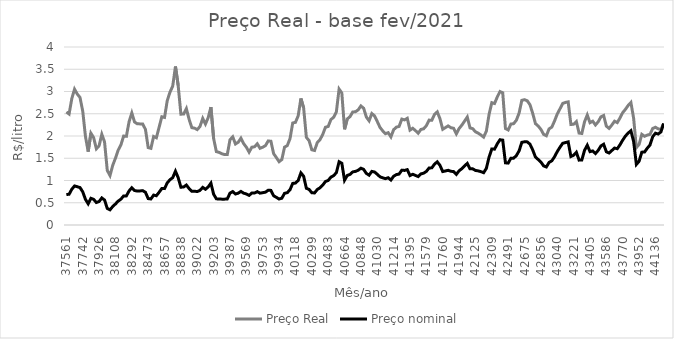
| Category | Preço Real | Preço nominal |
|---|---|---|
| 37561.0 | 2.539 | 0.685 |
| 37591.0 | 2.494 | 0.691 |
| 37622.0 | 2.842 | 0.804 |
| 37653.0 | 3.052 | 0.878 |
| 37681.0 | 2.943 | 0.86 |
| 37712.0 | 2.865 | 0.841 |
| 37742.0 | 2.56 | 0.746 |
| 37773.0 | 1.99 | 0.576 |
| 37803.0 | 1.649 | 0.476 |
| 37834.0 | 2.062 | 0.6 |
| 37865.0 | 1.963 | 0.577 |
| 37895.0 | 1.712 | 0.505 |
| 37926.0 | 1.78 | 0.528 |
| 37956.0 | 2.039 | 0.608 |
| 37987.0 | 1.866 | 0.561 |
| 38018.0 | 1.226 | 0.373 |
| 38047.0 | 1.112 | 0.341 |
| 38078.0 | 1.34 | 0.416 |
| 38108.0 | 1.502 | 0.473 |
| 38139.0 | 1.683 | 0.536 |
| 38169.0 | 1.8 | 0.581 |
| 38200.0 | 1.999 | 0.653 |
| 38231.0 | 1.993 | 0.654 |
| 38261.0 | 2.323 | 0.767 |
| 38292.0 | 2.517 | 0.838 |
| 38322.0 | 2.315 | 0.774 |
| 38353.0 | 2.275 | 0.763 |
| 38384.0 | 2.272 | 0.766 |
| 38412.0 | 2.269 | 0.772 |
| 38443.0 | 2.149 | 0.735 |
| 38473.0 | 1.739 | 0.593 |
| 38504.0 | 1.723 | 0.585 |
| 38534.0 | 1.989 | 0.673 |
| 38565.0 | 1.96 | 0.658 |
| 38596.0 | 2.195 | 0.736 |
| 38626.0 | 2.432 | 0.82 |
| 38657.0 | 2.417 | 0.818 |
| 38687.0 | 2.798 | 0.947 |
| 38718.0 | 2.986 | 1.018 |
| 38749.0 | 3.122 | 1.064 |
| 38777.0 | 3.562 | 1.208 |
| 38808.0 | 3.134 | 1.064 |
| 38838.0 | 2.491 | 0.849 |
| 38869.0 | 2.492 | 0.855 |
| 38899.0 | 2.615 | 0.898 |
| 38930.0 | 2.376 | 0.82 |
| 38961.0 | 2.187 | 0.756 |
| 38991.0 | 2.177 | 0.759 |
| 39022.0 | 2.144 | 0.752 |
| 39052.0 | 2.214 | 0.778 |
| 39083.0 | 2.395 | 0.845 |
| 39114.0 | 2.27 | 0.803 |
| 39142.0 | 2.412 | 0.855 |
| 39173.0 | 2.649 | 0.94 |
| 39203.0 | 1.943 | 0.691 |
| 39234.0 | 1.649 | 0.588 |
| 39264.0 | 1.632 | 0.584 |
| 39295.0 | 1.601 | 0.581 |
| 39326.0 | 1.583 | 0.581 |
| 39356.0 | 1.583 | 0.586 |
| 39387.0 | 1.917 | 0.716 |
| 39417.0 | 1.982 | 0.751 |
| 39448.0 | 1.821 | 0.697 |
| 39479.0 | 1.86 | 0.715 |
| 39508.0 | 1.95 | 0.755 |
| 39539.0 | 1.828 | 0.716 |
| 39569.0 | 1.748 | 0.697 |
| 39600.0 | 1.638 | 0.665 |
| 39630.0 | 1.748 | 0.718 |
| 39661.0 | 1.758 | 0.719 |
| 39692.0 | 1.825 | 0.75 |
| 39722.0 | 1.724 | 0.716 |
| 39753.0 | 1.748 | 0.726 |
| 39783.0 | 1.783 | 0.738 |
| 39814.0 | 1.889 | 0.781 |
| 39845.0 | 1.882 | 0.778 |
| 39873.0 | 1.603 | 0.657 |
| 39904.0 | 1.515 | 0.621 |
| 39934.0 | 1.422 | 0.584 |
| 39965.0 | 1.471 | 0.602 |
| 39995.0 | 1.75 | 0.712 |
| 40026.0 | 1.785 | 0.726 |
| 40057.0 | 1.939 | 0.791 |
| 40087.0 | 2.292 | 0.935 |
| 40118.0 | 2.307 | 0.942 |
| 40148.0 | 2.454 | 1 |
| 40179.0 | 2.844 | 1.171 |
| 40210.0 | 2.632 | 1.096 |
| 40238.0 | 1.97 | 0.825 |
| 40269.0 | 1.895 | 0.8 |
| 40299.0 | 1.69 | 0.724 |
| 40330.0 | 1.675 | 0.72 |
| 40360.0 | 1.851 | 0.798 |
| 40391.0 | 1.918 | 0.836 |
| 40422.0 | 2.034 | 0.896 |
| 40452.0 | 2.197 | 0.978 |
| 40483.0 | 2.214 | 1.001 |
| 40513.0 | 2.369 | 1.075 |
| 40544.0 | 2.421 | 1.109 |
| 40575.0 | 2.542 | 1.176 |
| 40603.0 | 3.055 | 1.422 |
| 40634.0 | 2.966 | 1.388 |
| 40664.0 | 2.15 | 1.006 |
| 40695.0 | 2.384 | 1.114 |
| 40725.0 | 2.435 | 1.137 |
| 40756.0 | 2.539 | 1.193 |
| 40787.0 | 2.545 | 1.205 |
| 40817.0 | 2.588 | 1.23 |
| 40848.0 | 2.676 | 1.277 |
| 40878.0 | 2.624 | 1.25 |
| 40909.0 | 2.425 | 1.159 |
| 40940.0 | 2.341 | 1.12 |
| 40969.0 | 2.504 | 1.204 |
| 41000.0 | 2.452 | 1.191 |
| 41030.0 | 2.326 | 1.14 |
| 41061.0 | 2.194 | 1.083 |
| 41091.0 | 2.115 | 1.06 |
| 41122.0 | 2.052 | 1.042 |
| 41153.0 | 2.075 | 1.062 |
| 41183.0 | 1.98 | 1.011 |
| 41214.0 | 2.142 | 1.096 |
| 41244.0 | 2.199 | 1.132 |
| 41275.0 | 2.215 | 1.145 |
| 41306.0 | 2.38 | 1.232 |
| 41334.0 | 2.362 | 1.226 |
| 41365.0 | 2.398 | 1.244 |
| 41395.0 | 2.132 | 1.11 |
| 41426.0 | 2.173 | 1.14 |
| 41456.0 | 2.122 | 1.114 |
| 41487.0 | 2.063 | 1.089 |
| 41518.0 | 2.147 | 1.148 |
| 41548.0 | 2.162 | 1.164 |
| 41579.0 | 2.232 | 1.205 |
| 41609.0 | 2.357 | 1.281 |
| 41640.0 | 2.355 | 1.285 |
| 41671.0 | 2.487 | 1.369 |
| 41699.0 | 2.542 | 1.42 |
| 41730.0 | 2.386 | 1.338 |
| 41760.0 | 2.151 | 1.201 |
| 41791.0 | 2.189 | 1.215 |
| 41821.0 | 2.227 | 1.229 |
| 41852.0 | 2.186 | 1.207 |
| 41883.0 | 2.174 | 1.201 |
| 41913.0 | 2.049 | 1.138 |
| 41944.0 | 2.168 | 1.218 |
| 41974.0 | 2.244 | 1.266 |
| 42005.0 | 2.335 | 1.326 |
| 42036.0 | 2.426 | 1.385 |
| 42064.0 | 2.183 | 1.261 |
| 42095.0 | 2.164 | 1.262 |
| 42125.0 | 2.095 | 1.226 |
| 42156.0 | 2.063 | 1.216 |
| 42186.0 | 2.022 | 1.199 |
| 42217.0 | 1.975 | 1.176 |
| 42248.0 | 2.109 | 1.273 |
| 42278.0 | 2.489 | 1.529 |
| 42309.0 | 2.749 | 1.709 |
| 42339.0 | 2.73 | 1.705 |
| 42370.0 | 2.878 | 1.824 |
| 42401.0 | 2.999 | 1.916 |
| 42430.0 | 2.971 | 1.907 |
| 42461.0 | 2.168 | 1.397 |
| 42491.0 | 2.136 | 1.391 |
| 42522.0 | 2.269 | 1.502 |
| 42552.0 | 2.277 | 1.502 |
| 42583.0 | 2.355 | 1.56 |
| 42614.0 | 2.515 | 1.666 |
| 42644.0 | 2.801 | 1.858 |
| 42675.0 | 2.816 | 1.869 |
| 42705.0 | 2.791 | 1.868 |
| 42736.0 | 2.701 | 1.816 |
| 42767.0 | 2.507 | 1.686 |
| 42795.0 | 2.278 | 1.526 |
| 42826.0 | 2.224 | 1.472 |
| 42856.0 | 2.148 | 1.414 |
| 42887.0 | 2.036 | 1.328 |
| 42917.0 | 2.006 | 1.304 |
| 42948.0 | 2.16 | 1.406 |
| 42979.0 | 2.2 | 1.442 |
| 43009.0 | 2.337 | 1.534 |
| 43040.0 | 2.496 | 1.651 |
| 43070.0 | 2.612 | 1.748 |
| 43101.0 | 2.732 | 1.836 |
| 43132.0 | 2.754 | 1.852 |
| 43160.0 | 2.767 | 1.868 |
| 43191.0 | 2.258 | 1.539 |
| 43221.0 | 2.264 | 1.568 |
| 43252.0 | 2.325 | 1.634 |
| 43282.0 | 2.065 | 1.458 |
| 43313.0 | 2.057 | 1.462 |
| 43344.0 | 2.32 | 1.678 |
| 43374.0 | 2.472 | 1.793 |
| 43405.0 | 2.299 | 1.649 |
| 43435.0 | 2.332 | 1.665 |
| 43466.0 | 2.248 | 1.606 |
| 43497.0 | 2.319 | 1.677 |
| 43525.0 | 2.43 | 1.776 |
| 43556.0 | 2.461 | 1.815 |
| 43586.0 | 2.221 | 1.645 |
| 43617.0 | 2.171 | 1.618 |
| 43647.0 | 2.246 | 1.674 |
| 43678.0 | 2.332 | 1.729 |
| 43709.0 | 2.301 | 1.715 |
| 43739.0 | 2.407 | 1.803 |
| 43770.0 | 2.527 | 1.909 |
| 43800.0 | 2.6 | 1.998 |
| 43831.0 | 2.687 | 2.068 |
| 43862.0 | 2.753 | 2.118 |
| 43891.0 | 2.397 | 1.875 |
| 43922.0 | 1.739 | 1.361 |
| 43952.0 | 1.811 | 1.432 |
| 43983.0 | 2.037 | 1.637 |
| 44013.0 | 1.994 | 1.64 |
| 44044.0 | 2.021 | 1.726 |
| 44075.0 | 2.037 | 1.797 |
| 44105.0 | 2.17 | 1.985 |
| 44136.0 | 2.197 | 2.063 |
| 44166.0 | 2.161 | 2.044 |
| 44197.0 | 2.147 | 2.091 |
| 44228.0 | 2.281 | 2.281 |